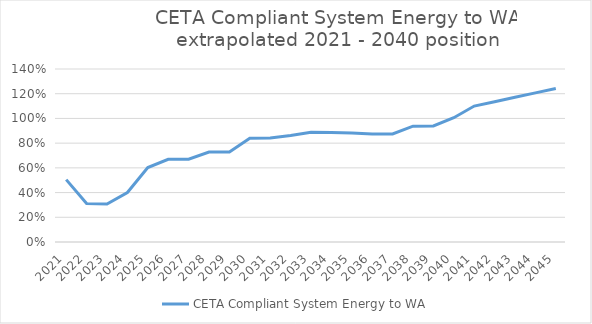
| Category | CETA Compliant System Energy to WA |
|---|---|
| 2021.0 | 0.505 |
| 2022.0 | 0.312 |
| 2023.0 | 0.307 |
| 2024.0 | 0.4 |
| 2025.0 | 0.602 |
| 2026.0 | 0.669 |
| 2027.0 | 0.671 |
| 2028.0 | 0.728 |
| 2029.0 | 0.729 |
| 2030.0 | 0.84 |
| 2031.0 | 0.841 |
| 2032.0 | 0.862 |
| 2033.0 | 0.888 |
| 2034.0 | 0.885 |
| 2035.0 | 0.883 |
| 2036.0 | 0.875 |
| 2037.0 | 0.875 |
| 2038.0 | 0.937 |
| 2039.0 | 0.94 |
| 2040.0 | 1.006 |
| 2041.0 | 1.1 |
| 2042.0 | 1.136 |
| 2043.0 | 1.171 |
| 2044.0 | 1.207 |
| 2045.0 | 1.242 |